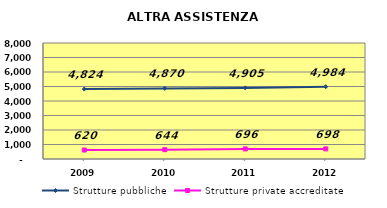
| Category | Strutture pubbliche | Strutture private accreditate |
|---|---|---|
| 2009.0 | 4824 | 620 |
| 2010.0 | 4870 | 644 |
| 2011.0 | 4905 | 696 |
| 2012.0 | 4984 | 698 |